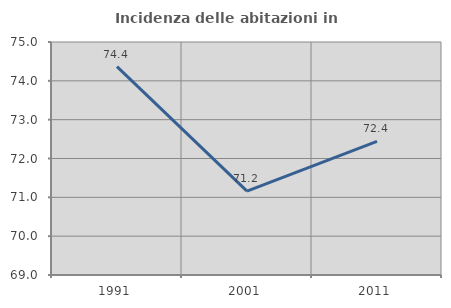
| Category | Incidenza delle abitazioni in proprietà  |
|---|---|
| 1991.0 | 74.367 |
| 2001.0 | 71.158 |
| 2011.0 | 72.441 |